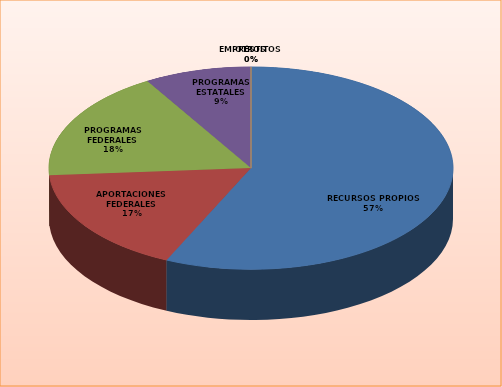
| Category | Series 0 |
|---|---|
| RECURSOS PROPIOS | 19938169 |
| APORTACIONES FEDERALES | 5968488 |
| PROGRAMAS FEDERALES | 6162300 |
| PROGRAMAS ESTATALES | 3000000 |
| EMPRÉSTITOS | 0 |
| OTROS | 0 |